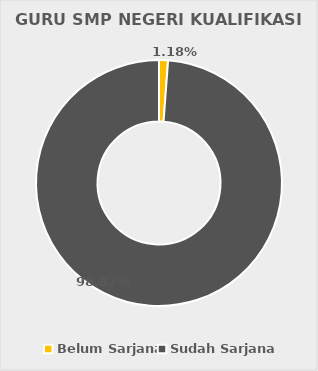
| Category | GURU SMP NEGERI KUALIFIKASI S1 |
|---|---|
| Belum Sarjana | 14 |
| Sudah Sarjana | 1173 |